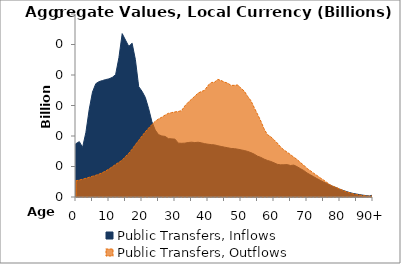
| Category | Public Transfers, Inflows | Public Transfers, Outflows |
|---|---|---|
| 0 | 8.751 | 2.656 |
|  | 9.072 | 2.785 |
| 2 | 8.138 | 2.923 |
| 3 | 10.593 | 3.072 |
| 4 | 14.343 | 3.232 |
| 5 | 17.21 | 3.403 |
| 6 | 18.577 | 3.56 |
| 7 | 18.916 | 3.757 |
| 8 | 19.089 | 3.989 |
| 9 | 19.247 | 4.273 |
| 10 | 19.369 | 4.592 |
| 11 | 19.611 | 4.96 |
| 12 | 20.049 | 5.341 |
| 13 | 22.823 | 5.687 |
| 14 | 26.787 | 6.05 |
| 15 | 25.724 | 6.644 |
| 16 | 24.69 | 7.168 |
| 17 | 25.21 | 7.828 |
| 18 | 22.519 | 8.579 |
| 19 | 18.098 | 9.282 |
| 20 | 17.336 | 9.98 |
| 21 | 16.331 | 10.688 |
| 22 | 14.51 | 11.296 |
| 23 | 12.344 | 11.873 |
| 24 | 10.987 | 12.403 |
| 25 | 10.23 | 12.792 |
| 26 | 10.003 | 13.081 |
| 27 | 9.935 | 13.434 |
| 28 | 9.562 | 13.716 |
| 29 | 9.532 | 13.833 |
| 30 | 9.481 | 13.949 |
| 31 | 8.828 | 14.014 |
| 32 | 8.806 | 14.168 |
| 33 | 8.83 | 14.943 |
| 34 | 8.932 | 15.529 |
| 35 | 8.986 | 16.023 |
| 36 | 8.92 | 16.524 |
| 37 | 8.978 | 17.034 |
| 38 | 8.879 | 17.295 |
| 39 | 8.745 | 17.495 |
| 40 | 8.654 | 18.294 |
| 41 | 8.586 | 18.76 |
| 42 | 8.54 | 18.837 |
| 43 | 8.401 | 19.29 |
| 44 | 8.281 | 19.088 |
| 45 | 8.171 | 18.83 |
| 46 | 8.07 | 18.661 |
| 47 | 7.958 | 18.296 |
| 48 | 7.925 | 18.306 |
| 49 | 7.843 | 18.373 |
| 50 | 7.725 | 17.823 |
| 51 | 7.619 | 17.354 |
| 52 | 7.473 | 16.505 |
| 53 | 7.277 | 15.797 |
| 54 | 7.028 | 14.664 |
| 55 | 6.7 | 13.584 |
| 56 | 6.494 | 12.455 |
| 57 | 6.212 | 11.164 |
| 58 | 5.997 | 10.224 |
| 59 | 5.834 | 9.887 |
| 60 | 5.604 | 9.384 |
| 61 | 5.359 | 8.844 |
| 62 | 5.273 | 8.181 |
| 63 | 5.286 | 7.716 |
| 64 | 5.313 | 7.344 |
| 65 | 5.163 | 6.946 |
| 66 | 5.232 | 6.528 |
| 67 | 4.971 | 6.151 |
| 68 | 4.652 | 5.653 |
| 69 | 4.347 | 5.22 |
| 70 | 3.945 | 4.682 |
| 71 | 3.64 | 4.323 |
| 72 | 3.338 | 3.908 |
| 73 | 3.02 | 3.53 |
| 74 | 2.743 | 3.145 |
| 75 | 2.461 | 2.788 |
| 76 | 2.223 | 2.386 |
| 77 | 1.951 | 1.995 |
| 78 | 1.71 | 1.748 |
| 79 | 1.503 | 1.526 |
| 80 | 1.263 | 1.292 |
| 81 | 1.065 | 1.055 |
| 82 | 0.883 | 0.83 |
| 83 | 0.718 | 0.656 |
| 84 | 0.574 | 0.507 |
| 85 | 0.483 | 0.41 |
| 86 | 0.382 | 0.314 |
| 87 | 0.295 | 0.235 |
| 88 | 0.222 | 0.171 |
| 89 | 0.162 | 0.12 |
| 90+ | 0.334 | 0.24 |